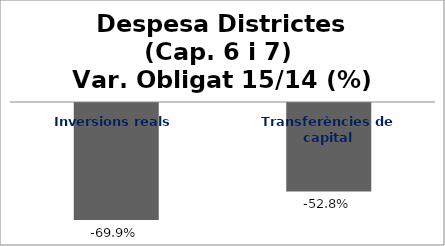
| Category | Series 0 |
|---|---|
| Inversions reals | -0.699 |
| Transferències de capital | -0.528 |